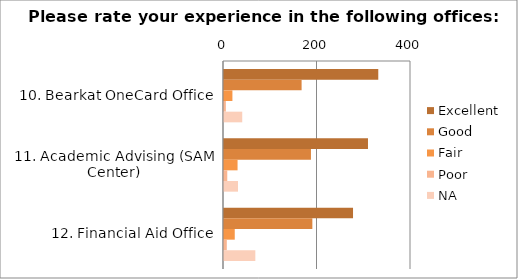
| Category | Excellent | Good | Fair | Poor | NA |
|---|---|---|---|---|---|
| 10. Bearkat OneCard Office | 330 | 166 | 18 | 4 | 39 |
| 11. Academic Advising (SAM Center) | 308 | 186 | 29 | 7 | 30 |
| 12. Financial Aid Office | 276 | 189 | 23 | 6 | 67 |